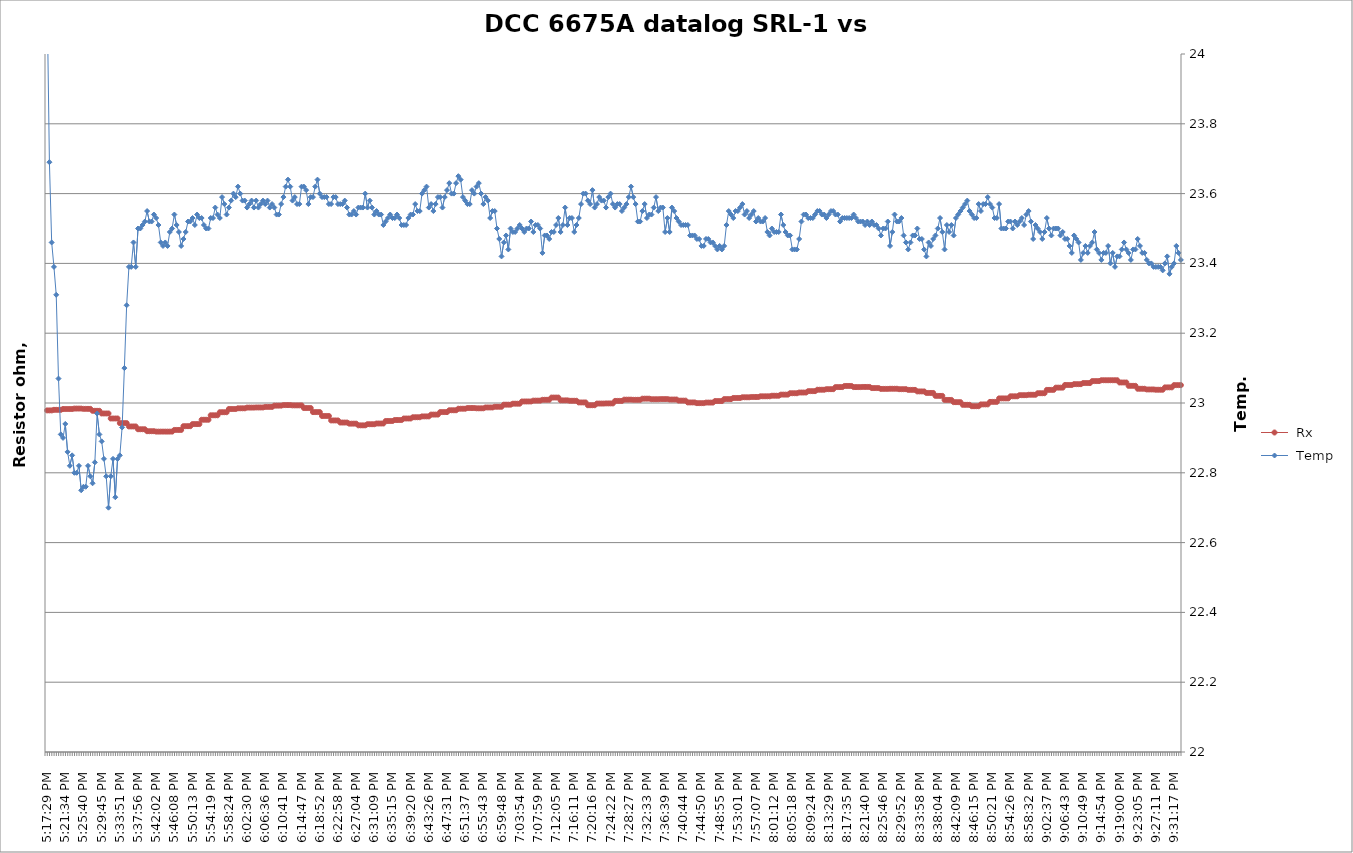
| Category |  Rx |
|---|---|
| 2021-03-06 17:17:29 | 10 |
| 2021-03-06 17:17:59 | 10 |
| 2021-03-06 17:18:30 | 10 |
| 2021-03-06 17:19:01 | 10 |
| 2021-03-06 17:19:31 | 10 |
| 2021-03-06 17:20:02 | 10 |
| 2021-03-06 17:20:33 | 10 |
| 2021-03-06 17:21:04 | 10 |
| 2021-03-06 17:21:34 | 10 |
| 2021-03-06 17:22:05 | 10 |
| 2021-03-06 17:22:36 | 10 |
| 2021-03-06 17:23:06 | 10 |
| 2021-03-06 17:23:37 | 10 |
| 2021-03-06 17:24:08 | 10 |
| 2021-03-06 17:24:38 | 10 |
| 2021-03-06 17:25:09 | 10 |
| 2021-03-06 17:25:40 | 10 |
| 2021-03-06 17:26:11 | 10 |
| 2021-03-06 17:26:41 | 10 |
| 2021-03-06 17:27:12 | 10 |
| 2021-03-06 17:27:43 | 10 |
| 2021-03-06 17:28:13 | 10 |
| 2021-03-06 17:28:44 | 10 |
| 2021-03-06 17:29:15 | 10 |
| 2021-03-06 17:29:45 | 10 |
| 2021-03-06 17:30:16 | 10 |
| 2021-03-06 17:30:47 | 10 |
| 2021-03-06 17:31:17 | 10 |
| 2021-03-06 17:31:48 | 10 |
| 2021-03-06 17:32:19 | 10 |
| 2021-03-06 17:32:50 | 10 |
| 2021-03-06 17:33:20 | 10 |
| 2021-03-06 17:33:51 | 10 |
| 2021-03-06 17:34:22 | 10 |
| 2021-03-06 17:34:52 | 10 |
| 2021-03-06 17:35:23 | 10 |
| 2021-03-06 17:35:54 | 10 |
| 2021-03-06 17:36:24 | 10 |
| 2021-03-06 17:36:55 | 10 |
| 2021-03-06 17:37:26 | 10 |
| 2021-03-06 17:37:56 | 10 |
| 2021-03-06 17:38:27 | 10 |
| 2021-03-06 17:38:58 | 10 |
| 2021-03-06 17:39:29 | 10 |
| 2021-03-06 17:39:59 | 10 |
| 2021-03-06 17:40:30 | 10 |
| 2021-03-06 17:41:01 | 10 |
| 2021-03-06 17:41:31 | 10 |
| 2021-03-06 17:42:02 | 10 |
| 2021-03-06 17:42:33 | 10 |
| 2021-03-06 17:43:03 | 10 |
| 2021-03-06 17:43:34 | 10 |
| 2021-03-06 17:44:05 | 10 |
| 2021-03-06 17:44:36 | 10 |
| 2021-03-06 17:45:06 | 10 |
| 2021-03-06 17:45:37 | 10 |
| 2021-03-06 17:46:08 | 10 |
| 2021-03-06 17:46:38 | 10 |
| 2021-03-06 17:47:09 | 10 |
| 2021-03-06 17:47:40 | 10 |
| 2021-03-06 17:48:10 | 10 |
| 2021-03-06 17:48:41 | 10 |
| 2021-03-06 17:49:12 | 10 |
| 2021-03-06 17:49:43 | 10 |
| 2021-03-06 17:50:13 | 10 |
| 2021-03-06 17:50:44 | 10 |
| 2021-03-06 17:51:15 | 10 |
| 2021-03-06 17:51:45 | 10 |
| 2021-03-06 17:52:16 | 10 |
| 2021-03-06 17:52:47 | 10 |
| 2021-03-06 17:53:17 | 10 |
| 2021-03-06 17:53:48 | 10 |
| 2021-03-06 17:54:19 | 10 |
| 2021-03-06 17:54:50 | 10 |
| 2021-03-06 17:55:20 | 10 |
| 2021-03-06 17:55:51 | 10 |
| 2021-03-06 17:56:22 | 10 |
| 2021-03-06 17:56:52 | 10 |
| 2021-03-06 17:57:23 | 10 |
| 2021-03-06 17:57:54 | 10 |
| 2021-03-06 17:58:24 | 10 |
| 2021-03-06 17:58:55 | 10 |
| 2021-03-06 17:59:26 | 10 |
| 2021-03-06 17:59:57 | 10 |
| 2021-03-06 18:00:27 | 10 |
| 2021-03-06 18:00:58 | 10 |
| 2021-03-06 18:01:29 | 10 |
| 2021-03-06 18:01:59 | 10 |
| 2021-03-06 18:02:30 | 10 |
| 2021-03-06 18:03:01 | 10 |
| 2021-03-06 18:03:31 | 10 |
| 2021-03-06 18:04:02 | 10 |
| 2021-03-06 18:04:33 | 10 |
| 2021-03-06 18:05:04 | 10 |
| 2021-03-06 18:05:34 | 10 |
| 2021-03-06 18:06:05 | 10 |
| 2021-03-06 18:06:36 | 10 |
| 2021-03-06 18:07:06 | 10 |
| 2021-03-06 18:07:37 | 10 |
| 2021-03-06 18:08:08 | 10 |
| 2021-03-06 18:08:38 | 10 |
| 2021-03-06 18:09:09 | 10 |
| 2021-03-06 18:09:40 | 10 |
| 2021-03-06 18:10:11 | 10 |
| 2021-03-06 18:10:41 | 10 |
| 2021-03-06 18:11:12 | 10 |
| 2021-03-06 18:11:43 | 10 |
| 2021-03-06 18:12:13 | 10 |
| 2021-03-06 18:12:44 | 10 |
| 2021-03-06 18:13:15 | 10 |
| 2021-03-06 18:13:45 | 10 |
| 2021-03-06 18:14:16 | 10 |
| 2021-03-06 18:14:47 | 10 |
| 2021-03-06 18:15:18 | 10 |
| 2021-03-06 18:15:48 | 10 |
| 2021-03-06 18:16:19 | 10 |
| 2021-03-06 18:16:50 | 10 |
| 2021-03-06 18:17:20 | 10 |
| 2021-03-06 18:17:51 | 10 |
| 2021-03-06 18:18:22 | 10 |
| 2021-03-06 18:18:52 | 10 |
| 2021-03-06 18:19:23 | 10 |
| 2021-03-06 18:19:54 | 10 |
| 2021-03-06 18:20:25 | 10 |
| 2021-03-06 18:20:55 | 10 |
| 2021-03-06 18:21:26 | 10 |
| 2021-03-06 18:21:57 | 10 |
| 2021-03-06 18:22:27 | 10 |
| 2021-03-06 18:22:58 | 10 |
| 2021-03-06 18:23:29 | 10 |
| 2021-03-06 18:23:59 | 10 |
| 2021-03-06 18:24:30 | 10 |
| 2021-03-06 18:25:01 | 10 |
| 2021-03-06 18:25:31 | 10 |
| 2021-03-06 18:26:02 | 10 |
| 2021-03-06 18:26:33 | 10 |
| 2021-03-06 18:27:04 | 10 |
| 2021-03-06 18:27:34 | 10 |
| 2021-03-06 18:28:05 | 10 |
| 2021-03-06 18:28:36 | 10 |
| 2021-03-06 18:29:06 | 10 |
| 2021-03-06 18:29:37 | 10 |
| 2021-03-06 18:30:08 | 10 |
| 2021-03-06 18:30:38 | 10 |
| 2021-03-06 18:31:09 | 10 |
| 2021-03-06 18:31:40 | 10 |
| 2021-03-06 18:32:11 | 10 |
| 2021-03-06 18:32:41 | 10 |
| 2021-03-06 18:33:12 | 10 |
| 2021-03-06 18:33:43 | 10 |
| 2021-03-06 18:34:13 | 10 |
| 2021-03-06 18:34:44 | 10 |
| 2021-03-06 18:35:15 | 10 |
| 2021-03-06 18:35:45 | 10 |
| 2021-03-06 18:36:16 | 10 |
| 2021-03-06 18:36:47 | 10 |
| 2021-03-06 18:37:18 | 10 |
| 2021-03-06 18:37:48 | 10 |
| 2021-03-06 18:38:19 | 10 |
| 2021-03-06 18:38:50 | 10 |
| 2021-03-06 18:39:20 | 10 |
| 2021-03-06 18:39:51 | 10 |
| 2021-03-06 18:40:22 | 10 |
| 2021-03-06 18:40:52 | 10 |
| 2021-03-06 18:41:23 | 10 |
| 2021-03-06 18:41:54 | 10 |
| 2021-03-06 18:42:24 | 10 |
| 2021-03-06 18:42:55 | 10 |
| 2021-03-06 18:43:26 | 10 |
| 2021-03-06 18:43:57 | 10 |
| 2021-03-06 18:44:27 | 10 |
| 2021-03-06 18:44:58 | 10 |
| 2021-03-06 18:45:29 | 10 |
| 2021-03-06 18:45:59 | 10 |
| 2021-03-06 18:46:30 | 10 |
| 2021-03-06 18:47:01 | 10 |
| 2021-03-06 18:47:31 | 10 |
| 2021-03-06 18:48:02 | 10 |
| 2021-03-06 18:48:33 | 10 |
| 2021-03-06 18:49:04 | 10 |
| 2021-03-06 18:49:34 | 10 |
| 2021-03-06 18:50:05 | 10 |
| 2021-03-06 18:50:36 | 10 |
| 2021-03-06 18:51:06 | 10 |
| 2021-03-06 18:51:37 | 10 |
| 2021-03-06 18:52:08 | 10 |
| 2021-03-06 18:52:38 | 10 |
| 2021-03-06 18:53:09 | 10 |
| 2021-03-06 18:53:40 | 10 |
| 2021-03-06 18:54:11 | 10 |
| 2021-03-06 18:54:41 | 10 |
| 2021-03-06 18:55:12 | 10 |
| 2021-03-06 18:55:43 | 10 |
| 2021-03-06 18:56:13 | 10 |
| 2021-03-06 18:56:44 | 10 |
| 2021-03-06 18:57:15 | 10 |
| 2021-03-06 18:57:45 | 10 |
| 2021-03-06 18:58:16 | 10 |
| 2021-03-06 18:58:47 | 10 |
| 2021-03-06 18:59:18 | 10 |
| 2021-03-06 18:59:48 | 10 |
| 2021-03-06 19:00:19 | 10 |
| 2021-03-06 19:00:50 | 10 |
| 2021-03-06 19:01:20 | 10 |
| 2021-03-06 19:01:51 | 10 |
| 2021-03-06 19:02:22 | 10 |
| 2021-03-06 19:02:52 | 10 |
| 2021-03-06 19:03:23 | 10 |
| 2021-03-06 19:03:54 | 10 |
| 2021-03-06 19:04:25 | 10 |
| 2021-03-06 19:04:55 | 10 |
| 2021-03-06 19:05:26 | 10 |
| 2021-03-06 19:05:57 | 10 |
| 2021-03-06 19:06:27 | 10 |
| 2021-03-06 19:06:58 | 10 |
| 2021-03-06 19:07:29 | 10 |
| 2021-03-06 19:07:59 | 10 |
| 2021-03-06 19:08:30 | 10 |
| 2021-03-06 19:09:01 | 10 |
| 2021-03-06 19:09:32 | 10 |
| 2021-03-06 19:10:02 | 10 |
| 2021-03-06 19:10:33 | 10 |
| 2021-03-06 19:11:04 | 10 |
| 2021-03-06 19:11:34 | 10 |
| 2021-03-06 19:12:05 | 10 |
| 2021-03-06 19:12:36 | 10 |
| 2021-03-06 19:13:06 | 10 |
| 2021-03-06 19:13:37 | 10 |
| 2021-03-06 19:14:08 | 10 |
| 2021-03-06 19:14:39 | 10 |
| 2021-03-06 19:15:09 | 10 |
| 2021-03-06 19:15:40 | 10 |
| 2021-03-06 19:16:11 | 10 |
| 2021-03-06 19:16:41 | 10 |
| 2021-03-06 19:17:12 | 10 |
| 2021-03-06 19:17:43 | 10 |
| 2021-03-06 19:18:13 | 10 |
| 2021-03-06 19:18:44 | 10 |
| 2021-03-06 19:19:15 | 10 |
| 2021-03-06 19:19:46 | 10 |
| 2021-03-06 19:20:16 | 10 |
| 2021-03-06 19:20:47 | 10 |
| 2021-03-06 19:21:18 | 10 |
| 2021-03-06 19:21:48 | 10 |
| 2021-03-06 19:22:19 | 10 |
| 2021-03-06 19:22:50 | 10 |
| 2021-03-06 19:23:20 | 10 |
| 2021-03-06 19:23:51 | 10 |
| 2021-03-06 19:24:22 | 10 |
| 2021-03-06 19:24:53 | 10 |
| 2021-03-06 19:25:23 | 10 |
| 2021-03-06 19:25:54 | 10 |
| 2021-03-06 19:26:25 | 10 |
| 2021-03-06 19:26:55 | 10 |
| 2021-03-06 19:27:26 | 10 |
| 2021-03-06 19:27:57 | 10 |
| 2021-03-06 19:28:27 | 10 |
| 2021-03-06 19:28:58 | 10 |
| 2021-03-06 19:29:29 | 10 |
| 2021-03-06 19:30:00 | 10 |
| 2021-03-06 19:30:30 | 10 |
| 2021-03-06 19:31:01 | 10 |
| 2021-03-06 19:31:32 | 10 |
| 2021-03-06 19:32:02 | 10 |
| 2021-03-06 19:32:33 | 10 |
| 2021-03-06 19:33:04 | 10 |
| 2021-03-06 19:33:34 | 10 |
| 2021-03-06 19:34:05 | 10 |
| 2021-03-06 19:34:36 | 10 |
| 2021-03-06 19:35:07 | 10 |
| 2021-03-06 19:35:37 | 10 |
| 2021-03-06 19:36:08 | 10 |
| 2021-03-06 19:36:39 | 10 |
| 2021-03-06 19:37:09 | 10 |
| 2021-03-06 19:37:40 | 10 |
| 2021-03-06 19:38:11 | 10 |
| 2021-03-06 19:38:41 | 10 |
| 2021-03-06 19:39:12 | 10 |
| 2021-03-06 19:39:43 | 10 |
| 2021-03-06 19:40:14 | 10 |
| 2021-03-06 19:40:44 | 10 |
| 2021-03-06 19:41:15 | 10 |
| 2021-03-06 19:41:46 | 10 |
| 2021-03-06 19:42:16 | 10 |
| 2021-03-06 19:42:47 | 10 |
| 2021-03-06 19:43:18 | 10 |
| 2021-03-06 19:43:48 | 10 |
| 2021-03-06 19:44:19 | 10 |
| 2021-03-06 19:44:50 | 10 |
| 2021-03-06 19:45:21 | 10 |
| 2021-03-06 19:45:51 | 10 |
| 2021-03-06 19:46:22 | 10 |
| 2021-03-06 19:46:53 | 10 |
| 2021-03-06 19:47:23 | 10 |
| 2021-03-06 19:47:54 | 10 |
| 2021-03-06 19:48:25 | 10 |
| 2021-03-06 19:48:55 | 10 |
| 2021-03-06 19:49:26 | 10 |
| 2021-03-06 19:49:57 | 10 |
| 2021-03-06 19:50:28 | 10 |
| 2021-03-06 19:50:58 | 10 |
| 2021-03-06 19:51:29 | 10 |
| 2021-03-06 19:52:00 | 10 |
| 2021-03-06 19:52:30 | 10 |
| 2021-03-06 19:53:01 | 10 |
| 2021-03-06 19:53:32 | 10 |
| 2021-03-06 19:54:02 | 10 |
| 2021-03-06 19:54:33 | 10 |
| 2021-03-06 19:55:04 | 10 |
| 2021-03-06 19:55:35 | 10 |
| 2021-03-06 19:56:05 | 10 |
| 2021-03-06 19:56:36 | 10 |
| 2021-03-06 19:57:07 | 10 |
| 2021-03-06 19:57:37 | 10 |
| 2021-03-06 19:58:08 | 10 |
| 2021-03-06 19:58:39 | 10 |
| 2021-03-06 19:59:10 | 10 |
| 2021-03-06 19:59:40 | 10 |
| 2021-03-06 20:00:11 | 10 |
| 2021-03-06 20:00:42 | 10 |
| 2021-03-06 20:01:12 | 10 |
| 2021-03-06 20:01:43 | 10 |
| 2021-03-06 20:02:14 | 10 |
| 2021-03-06 20:02:44 | 10 |
| 2021-03-06 20:03:15 | 10 |
| 2021-03-06 20:03:46 | 10 |
| 2021-03-06 20:04:17 | 10 |
| 2021-03-06 20:04:47 | 10 |
| 2021-03-06 20:05:18 | 10 |
| 2021-03-06 20:05:49 | 10 |
| 2021-03-06 20:06:19 | 10 |
| 2021-03-06 20:06:50 | 10 |
| 2021-03-06 20:07:21 | 10 |
| 2021-03-06 20:07:51 | 10 |
| 2021-03-06 20:08:22 | 10 |
| 2021-03-06 20:08:53 | 10 |
| 2021-03-06 20:09:24 | 10 |
| 2021-03-06 20:09:54 | 10 |
| 2021-03-06 20:10:25 | 10 |
| 2021-03-06 20:10:56 | 10 |
| 2021-03-06 20:11:26 | 10 |
| 2021-03-06 20:11:57 | 10 |
| 2021-03-06 20:12:28 | 10 |
| 2021-03-06 20:12:58 | 10 |
| 2021-03-06 20:13:29 | 10 |
| 2021-03-06 20:14:00 | 10 |
| 2021-03-06 20:14:31 | 10 |
| 2021-03-06 20:15:01 | 10 |
| 2021-03-06 20:15:32 | 10 |
| 2021-03-06 20:16:03 | 10 |
| 2021-03-06 20:16:33 | 10 |
| 2021-03-06 20:17:04 | 10 |
| 2021-03-06 20:17:35 | 10 |
| 2021-03-06 20:18:05 | 10 |
| 2021-03-06 20:18:36 | 10 |
| 2021-03-06 20:19:07 | 10 |
| 2021-03-06 20:19:38 | 10 |
| 2021-03-06 20:20:08 | 10 |
| 2021-03-06 20:20:39 | 10 |
| 2021-03-06 20:21:10 | 10 |
| 2021-03-06 20:21:40 | 10 |
| 2021-03-06 20:22:11 | 10 |
| 2021-03-06 20:22:42 | 10 |
| 2021-03-06 20:23:12 | 10 |
| 2021-03-06 20:23:43 | 10 |
| 2021-03-06 20:24:14 | 10 |
| 2021-03-06 20:24:45 | 10 |
| 2021-03-06 20:25:15 | 10 |
| 2021-03-06 20:25:46 | 10 |
| 2021-03-06 20:26:17 | 10 |
| 2021-03-06 20:26:47 | 10 |
| 2021-03-06 20:27:18 | 10 |
| 2021-03-06 20:27:49 | 10 |
| 2021-03-06 20:28:19 | 10 |
| 2021-03-06 20:28:50 | 10 |
| 2021-03-06 20:29:21 | 10 |
| 2021-03-06 20:29:52 | 10 |
| 2021-03-06 20:30:22 | 10 |
| 2021-03-06 20:30:53 | 10 |
| 2021-03-06 20:31:25 | 10 |
| 2021-03-06 20:31:55 | 10 |
| 2021-03-06 20:32:26 | 10 |
| 2021-03-06 20:32:57 | 10 |
| 2021-03-06 20:33:27 | 10 |
| 2021-03-06 20:33:58 | 10 |
| 2021-03-06 20:34:29 | 10 |
| 2021-03-06 20:35:00 | 10 |
| 2021-03-06 20:35:30 | 10 |
| 2021-03-06 20:36:01 | 10 |
| 2021-03-06 20:36:32 | 10 |
| 2021-03-06 20:37:02 | 10 |
| 2021-03-06 20:37:33 | 10 |
| 2021-03-06 20:38:04 | 10 |
| 2021-03-06 20:38:34 | 10 |
| 2021-03-06 20:39:05 | 10 |
| 2021-03-06 20:39:36 | 10 |
| 2021-03-06 20:40:07 | 10 |
| 2021-03-06 20:40:37 | 10 |
| 2021-03-06 20:41:08 | 10 |
| 2021-03-06 20:41:39 | 10 |
| 2021-03-06 20:42:09 | 10 |
| 2021-03-06 20:42:40 | 10 |
| 2021-03-06 20:43:11 | 10 |
| 2021-03-06 20:43:41 | 10 |
| 2021-03-06 20:44:12 | 10 |
| 2021-03-06 20:44:43 | 10 |
| 2021-03-06 20:45:14 | 10 |
| 2021-03-06 20:45:44 | 10 |
| 2021-03-06 20:46:15 | 10 |
| 2021-03-06 20:46:46 | 10 |
| 2021-03-06 20:47:16 | 10 |
| 2021-03-06 20:47:47 | 10 |
| 2021-03-06 20:48:18 | 10 |
| 2021-03-06 20:48:48 | 10 |
| 2021-03-06 20:49:19 | 10 |
| 2021-03-06 20:49:50 | 10 |
| 2021-03-06 20:50:21 | 10 |
| 2021-03-06 20:50:51 | 10 |
| 2021-03-06 20:51:22 | 10 |
| 2021-03-06 20:51:53 | 10 |
| 2021-03-06 20:52:23 | 10 |
| 2021-03-06 20:52:54 | 10 |
| 2021-03-06 20:53:25 | 10 |
| 2021-03-06 20:53:55 | 10 |
| 2021-03-06 20:54:26 | 10 |
| 2021-03-06 20:54:57 | 10 |
| 2021-03-06 20:55:28 | 10 |
| 2021-03-06 20:55:58 | 10 |
| 2021-03-06 20:56:29 | 10 |
| 2021-03-06 20:57:00 | 10 |
| 2021-03-06 20:57:30 | 10 |
| 2021-03-06 20:58:01 | 10 |
| 2021-03-06 20:58:32 | 10 |
| 2021-03-06 20:59:02 | 10 |
| 2021-03-06 20:59:33 | 10 |
| 2021-03-06 21:00:04 | 10 |
| 2021-03-06 21:00:35 | 10 |
| 2021-03-06 21:01:05 | 10 |
| 2021-03-06 21:01:36 | 10 |
| 2021-03-06 21:02:07 | 10 |
| 2021-03-06 21:02:37 | 10 |
| 2021-03-06 21:03:08 | 10 |
| 2021-03-06 21:03:39 | 10 |
| 2021-03-06 21:04:09 | 10 |
| 2021-03-06 21:04:40 | 10 |
| 2021-03-06 21:05:11 | 10 |
| 2021-03-06 21:05:42 | 10 |
| 2021-03-06 21:06:12 | 10 |
| 2021-03-06 21:06:43 | 10 |
| 2021-03-06 21:07:14 | 10 |
| 2021-03-06 21:07:44 | 10 |
| 2021-03-06 21:08:15 | 10 |
| 2021-03-06 21:08:46 | 10 |
| 2021-03-06 21:09:16 | 10 |
| 2021-03-06 21:09:47 | 10 |
| 2021-03-06 21:10:18 | 10 |
| 2021-03-06 21:10:49 | 10 |
| 2021-03-06 21:11:19 | 10 |
| 2021-03-06 21:11:50 | 10 |
| 2021-03-06 21:12:21 | 10 |
| 2021-03-06 21:12:51 | 10 |
| 2021-03-06 21:13:22 | 10 |
| 2021-03-06 21:13:53 | 10 |
| 2021-03-06 21:14:23 | 10 |
| 2021-03-06 21:14:54 | 10 |
| 2021-03-06 21:15:25 | 10 |
| 2021-03-06 21:15:56 | 10 |
| 2021-03-06 21:16:26 | 10 |
| 2021-03-06 21:16:57 | 10 |
| 2021-03-06 21:17:28 | 10 |
| 2021-03-06 21:17:58 | 10 |
| 2021-03-06 21:18:29 | 10 |
| 2021-03-06 21:19:00 | 10 |
| 2021-03-06 21:19:30 | 10 |
| 2021-03-06 21:20:01 | 10 |
| 2021-03-06 21:20:32 | 10 |
| 2021-03-06 21:21:03 | 10 |
| 2021-03-06 21:21:33 | 10 |
| 2021-03-06 21:22:04 | 10 |
| 2021-03-06 21:22:35 | 10 |
| 2021-03-06 21:23:05 | 10 |
| 2021-03-06 21:23:36 | 10 |
| 2021-03-06 21:24:07 | 10 |
| 2021-03-06 21:24:37 | 10 |
| 2021-03-06 21:25:08 | 10 |
| 2021-03-06 21:25:39 | 10 |
| 2021-03-06 21:26:10 | 10 |
| 2021-03-06 21:26:40 | 10 |
| 2021-03-06 21:27:11 | 10 |
| 2021-03-06 21:27:42 | 10 |
| 2021-03-06 21:28:12 | 10 |
| 2021-03-06 21:28:43 | 10 |
| 2021-03-06 21:29:14 | 10 |
| 2021-03-06 21:29:44 | 10 |
| 2021-03-06 21:30:15 | 10 |
| 2021-03-06 21:30:46 | 10 |
| 2021-03-06 21:31:17 | 10 |
| 2021-03-06 21:31:47 | 10 |
| 2021-03-06 21:32:18 | 10 |
| 2021-03-06 21:32:49 | 10 |